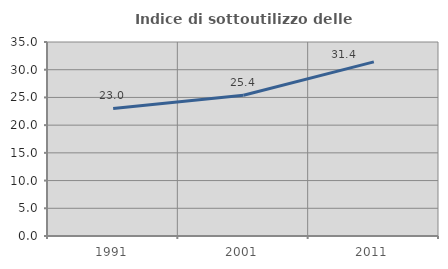
| Category | Indice di sottoutilizzo delle abitazioni  |
|---|---|
| 1991.0 | 23.004 |
| 2001.0 | 25.4 |
| 2011.0 | 31.421 |